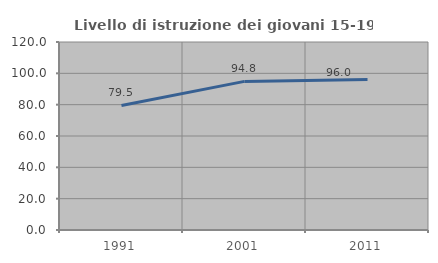
| Category | Livello di istruzione dei giovani 15-19 anni |
|---|---|
| 1991.0 | 79.505 |
| 2001.0 | 94.85 |
| 2011.0 | 96.023 |